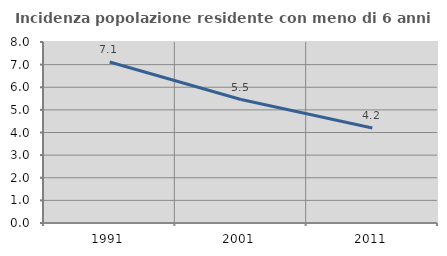
| Category | Incidenza popolazione residente con meno di 6 anni |
|---|---|
| 1991.0 | 7.115 |
| 2001.0 | 5.458 |
| 2011.0 | 4.198 |